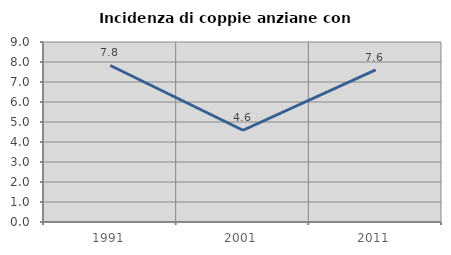
| Category | Incidenza di coppie anziane con figli |
|---|---|
| 1991.0 | 7.826 |
| 2001.0 | 4.587 |
| 2011.0 | 7.609 |